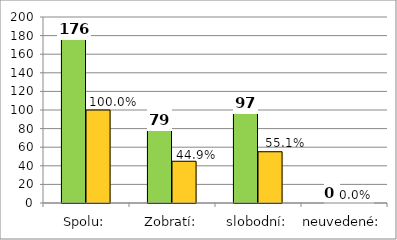
| Category | Series 0 | Series 1 |
|---|---|---|
| Spolu: | 176 | 100 |
| Zobratí: | 79 | 44.886 |
| slobodní: | 97 | 55.114 |
| neuvedené: | 0 | 0 |